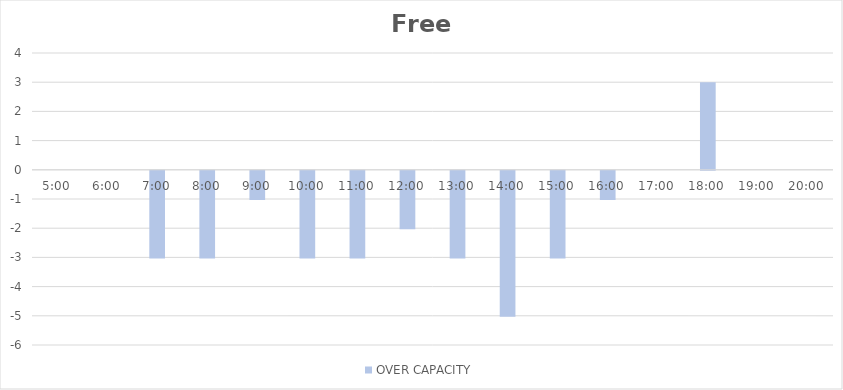
| Category | OVER CAPACITY |
|---|---|
| 0.20833333333333334 | 0 |
| 0.25 | 0 |
| 0.2916666666666667 | -3 |
| 0.3333333333333333 | -3 |
| 0.375 | -1 |
| 0.4166666666666667 | -3 |
| 0.4583333333333333 | -3 |
| 0.5 | -2 |
| 0.5416666666666666 | -3 |
| 0.5833333333333334 | -5 |
| 0.625 | -3 |
| 0.6666666666666666 | -1 |
| 0.7083333333333334 | 0 |
| 0.75 | 3 |
| 0.7916666666666666 | 0 |
| 0.8333333333333334 | 0 |